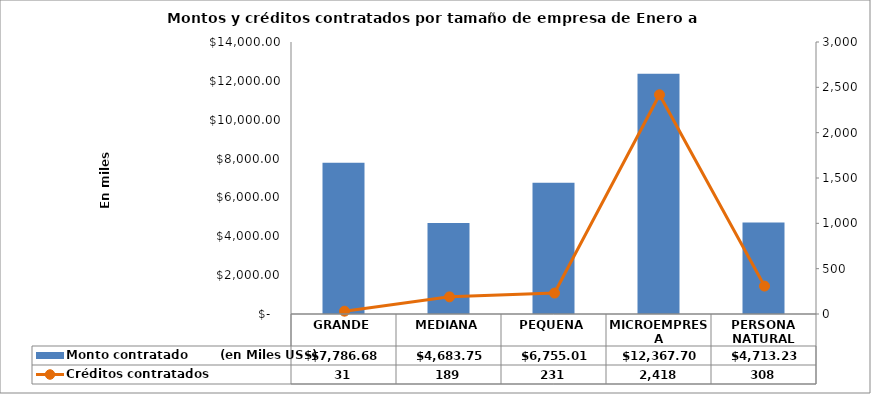
| Category | Monto contratado        (en Miles US$) |
|---|---|
| GRANDE | 7786.676 |
| MEDIANA | 4683.745 |
| PEQUENA | 6755.009 |
| MICROEMPRESA | 12367.703 |
| PERSONA NATURAL | 4713.226 |